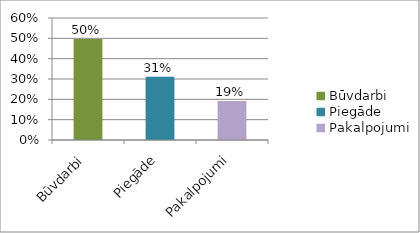
| Category | Series 0 |
|---|---|
| Būvdarbi | 0.496 |
| Piegāde | 0.312 |
| Pakalpojumi | 0.192 |